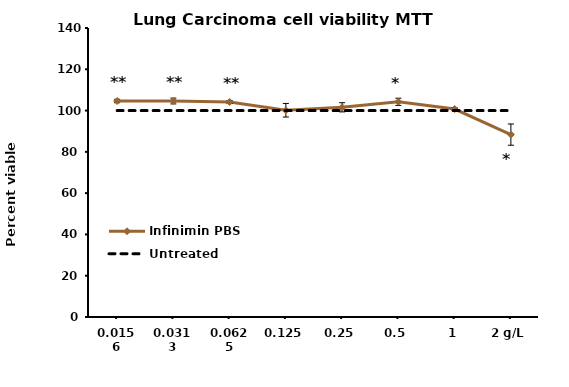
| Category | Infinimin PBS | Untreated |
|---|---|---|
| 0.0156 | 104.633 | 100 |
| 0.0313 | 104.633 | 100 |
| 0.0625 | 104.157 | 100 |
| 0.125 | 100.159 | 100 |
| 0.25 | 101.587 | 100 |
| 0.5 | 104.253 | 100 |
| 1 | 100.73 | 100 |
| 2 g/L | 88.353 | 100 |